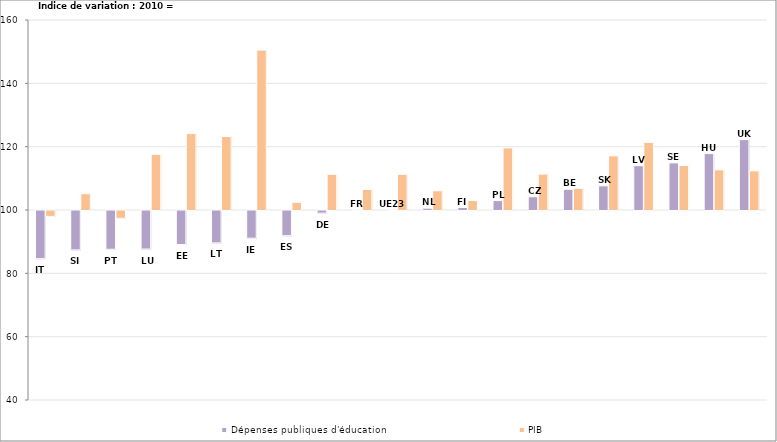
| Category | Dépenses publiques d'éducation | PIB |
|---|---|---|
| IT | 84.79 | 98.136 |
| SI | 87.56 | 105.139 |
| PT | 87.758 | 97.541 |
| LU | 87.823 | 117.556 |
| EE | 89.258 | 124.132 |
| LT | 89.772 | 123.201 |
| IE | 91.252 | 150.492 |
| ES | 92.048 | 102.407 |
| DE | 99.153 | 111.26 |
| FR | 100.004 | 106.48 |
| UE23 | 100.052 | 111.271 |
| NL | 100.575 | 106.072 |
| FI | 100.786 | 102.985 |
| PL | 102.982 | 119.627 |
| CZ | 104.188 | 111.346 |
| BE | 106.536 | 106.856 |
| SK | 107.641 | 117.098 |
| LV | 113.997 | 121.355 |
| SE | 114.878 | 114.057 |
| HU | 117.809 | 112.682 |
| UK | 122.233 | 112.357 |